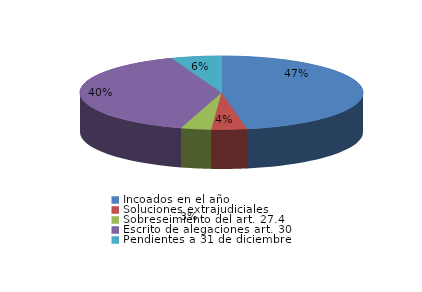
| Category | Series 0 |
|---|---|
| Incoados en el año | 82 |
| Soluciones extrajudiciales | 7 |
| Sobreseimiento del art. 27.4 | 6 |
| Escrito de alegaciones art. 30 | 69 |
| Pendientes a 31 de diciembre | 10 |